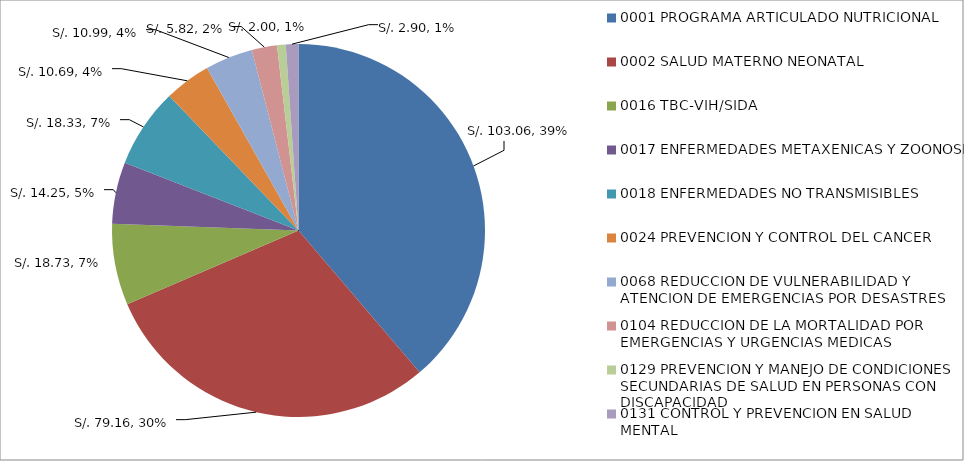
| Category | Series 0 |
|---|---|
| 0001 PROGRAMA ARTICULADO NUTRICIONAL | 103.063 |
| 0002 SALUD MATERNO NEONATAL | 79.156 |
| 0016 TBC-VIH/SIDA | 18.728 |
| 0017 ENFERMEDADES METAXENICAS Y ZOONOSIS | 14.249 |
| 0018 ENFERMEDADES NO TRANSMISIBLES | 18.331 |
| 0024 PREVENCION Y CONTROL DEL CANCER | 10.692 |
| 0068 REDUCCION DE VULNERABILIDAD Y ATENCION DE EMERGENCIAS POR DESASTRES | 10.986 |
| 0104 REDUCCION DE LA MORTALIDAD POR EMERGENCIAS Y URGENCIAS MEDICAS | 5.818 |
| 0129 PREVENCION Y MANEJO DE CONDICIONES SECUNDARIAS DE SALUD EN PERSONAS CON DISCAPACIDAD | 1.995 |
| 0131 CONTROL Y PREVENCION EN SALUD MENTAL | 2.901 |